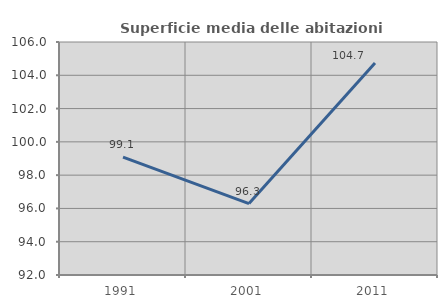
| Category | Superficie media delle abitazioni occupate |
|---|---|
| 1991.0 | 99.087 |
| 2001.0 | 96.289 |
| 2011.0 | 104.735 |